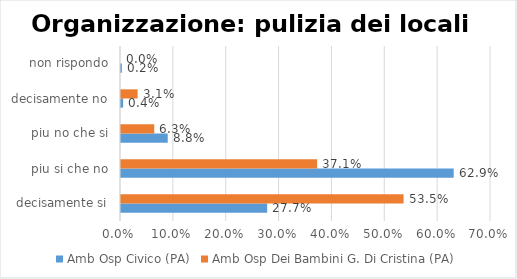
| Category | Amb Osp Civico (PA) | Amb Osp Dei Bambini G. Di Cristina (PA) |
|---|---|---|
| decisamente si | 0.277 | 0.535 |
| piu si che no | 0.629 | 0.371 |
| piu no che si | 0.088 | 0.063 |
| decisamente no | 0.004 | 0.031 |
| non rispondo | 0.002 | 0 |